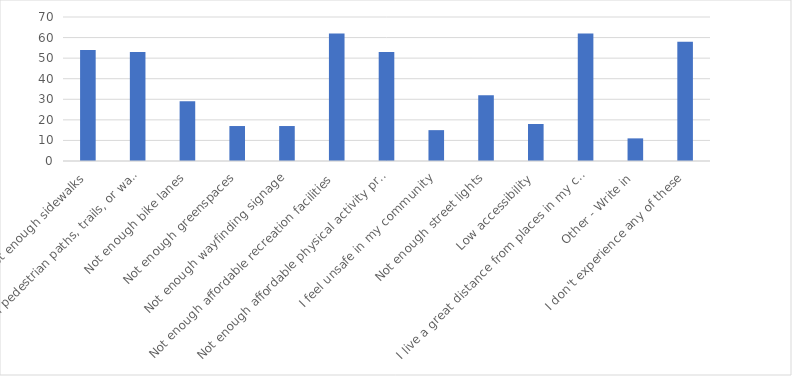
| Category | Number of Responses |
|---|---|
| Not enough sidewalks | 54 |
| Not enough pedestrian paths, trails, or walkways | 53 |
| Not enough bike lanes | 29 |
| Not enough greenspaces | 17 |
| Not enough wayfinding signage | 17 |
| Not enough affordable recreation facilities | 62 |
| Not enough affordable physical activity programs | 53 |
| I feel unsafe in my community | 15 |
| Not enough street lights | 32 |
| Low accessibility | 18 |
| I live a great distance from places in my community | 62 |
| Other - Write in | 11 |
| I don't experience any of these | 58 |